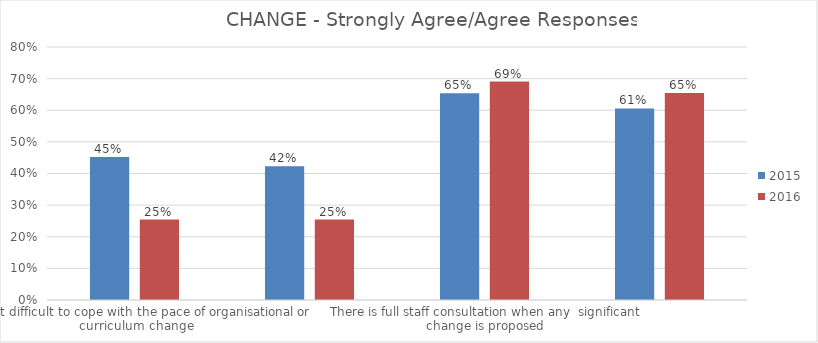
| Category | 2015 | 2016 |
|---|---|---|
| I find it difficult to cope with the pace of organisational or curriculum change | 0.452 | 0.255 |
| I find the introduction of new initiatives daunting | 0.423 | 0.255 |
| There is full staff consultation when any  significant change is proposed | 0.654 | 0.691 |
| Changes are accompanied by appropriate support and training, where necessary | 0.606 | 0.655 |